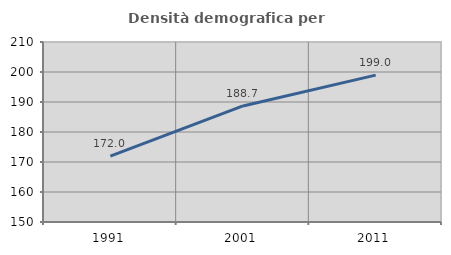
| Category | Densità demografica |
|---|---|
| 1991.0 | 171.977 |
| 2001.0 | 188.679 |
| 2011.0 | 198.957 |